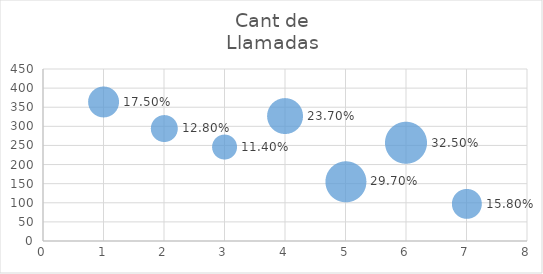
| Category | Cant de
Llamadas |
|---|---|
| 0 | 364 |
| 1 | 295 |
| 2 | 246 |
| 3 | 327 |
| 4 | 156 |
| 5 | 257 |
| 6 | 98 |